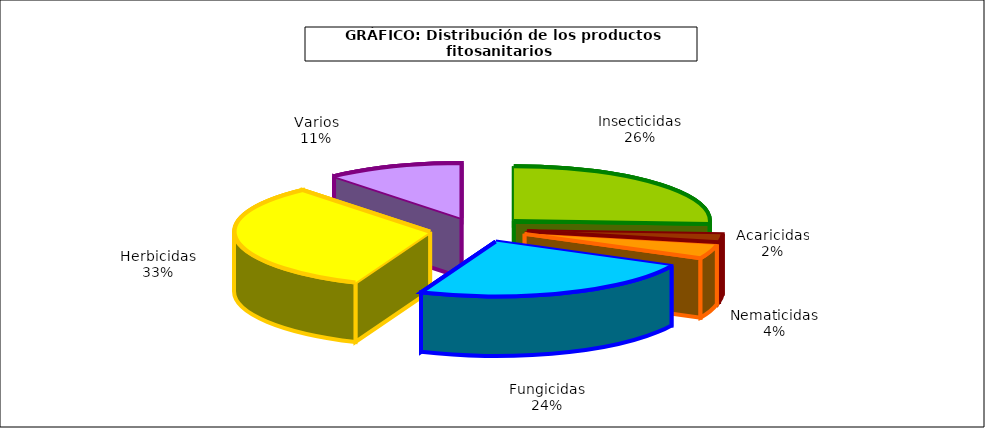
| Category | Insecticidas |
|---|---|
| Insecticidas | 294.442 |
| Acaricidas | 27.081 |
| Nematicidas | 46.818 |
| Fungicidas | 272.711 |
| Herbicidas | 370.971 |
| Varios | 128.333 |